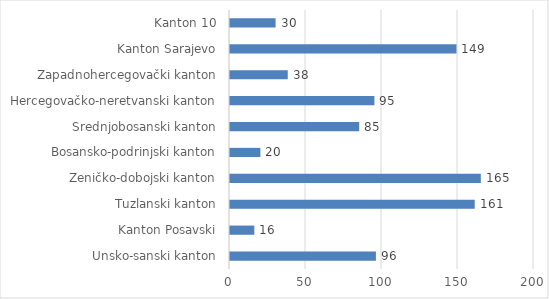
| Category | Series 0 |
|---|---|
| Unsko-sanski kanton | 96 |
| Kanton Posavski | 16 |
| Tuzlanski kanton | 161 |
| Zeničko-dobojski kanton | 165 |
| Bosansko-podrinjski kanton | 20 |
| Srednjobosanski kanton | 85 |
| Hercegovačko-neretvanski kanton | 95 |
| Zapadnohercegovački kanton | 38 |
| Kanton Sarajevo | 149 |
| Kanton 10 | 30 |